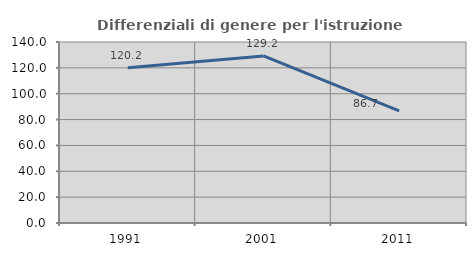
| Category | Differenziali di genere per l'istruzione superiore |
|---|---|
| 1991.0 | 120.158 |
| 2001.0 | 129.196 |
| 2011.0 | 86.712 |